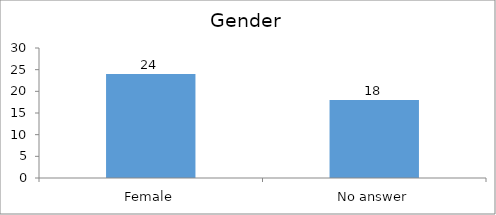
| Category | Gender |
|---|---|
| Female | 24 |
| No answer | 18 |